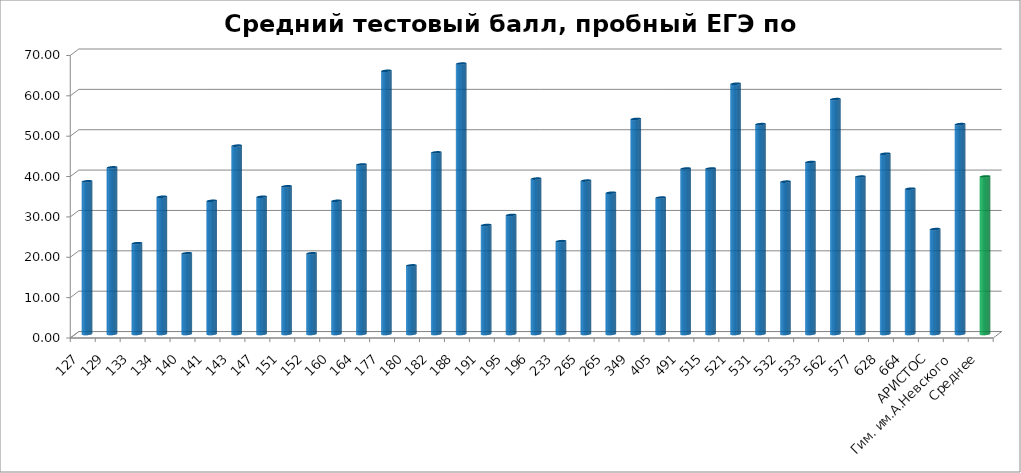
| Category | Тестовый |
|---|---|
| 127 | 37.833 |
| 129 | 41.286 |
| 133 | 22.5 |
| 134 | 34 |
| 140 | 20 |
| 141 | 33 |
| 143 | 46.667 |
| 147 | 34 |
| 151 | 36.6 |
| 152 | 20 |
| 160 | 33 |
| 164 | 42 |
| 177 | 65.2 |
| 180 | 17 |
| 182 | 45 |
| 188 | 67 |
| 191 | 27 |
| 195 | 29.5 |
| 196 | 38.5 |
| 233 | 23 |
| 265 | 38 |
| 265 | 35 |
| 349 | 53.286 |
| 405 | 33.8 |
| 491 | 41 |
| 515 | 41 |
| 521 | 62 |
| 531 | 52 |
| 532 | 37.75 |
| 533 | 42.609 |
| 562 | 58.2 |
| 577 | 39 |
| 628 | 44.667 |
| 664 | 36 |
| АРИСТОС | 26 |
| Гим. им.А.Невского | 52 |
| Среднее | 39.039 |